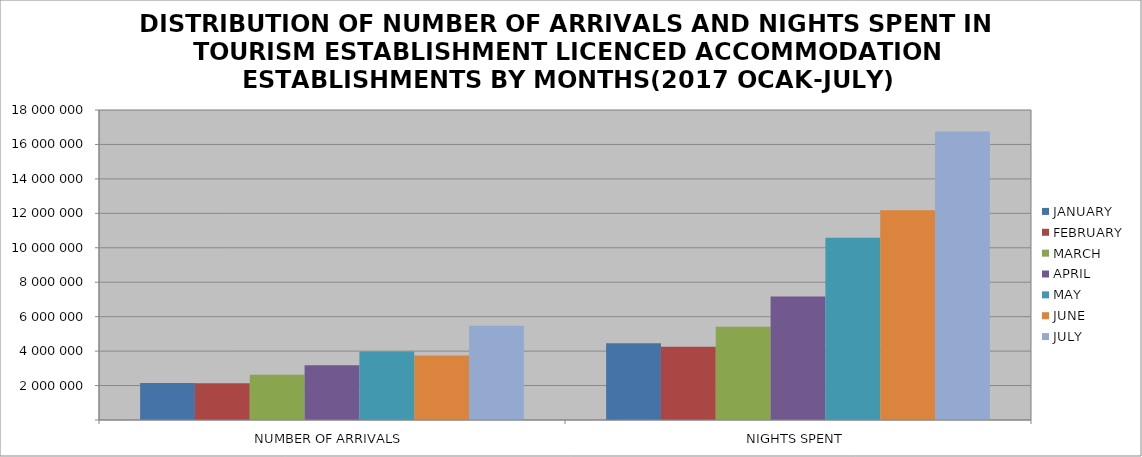
| Category | JANUARY | FEBRUARY | MARCH | APRIL | MAY | JUNE | JULY |
|---|---|---|---|---|---|---|---|
| NUMBER OF ARRIVALS | 2146994 | 2141043 | 2629734 | 3173381 | 3978651 | 3742131 | 5470767 |
| NIGHTS SPENT | 4457352 | 4260377 | 5413903 | 7176325 | 10579158 | 12172370 | 16748728 |